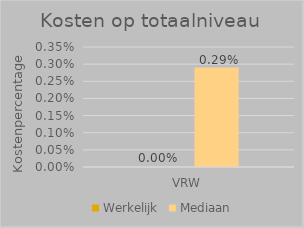
| Category | Werkelijk | Mediaan |
|---|---|---|
| VRW | 0 | 0.003 |